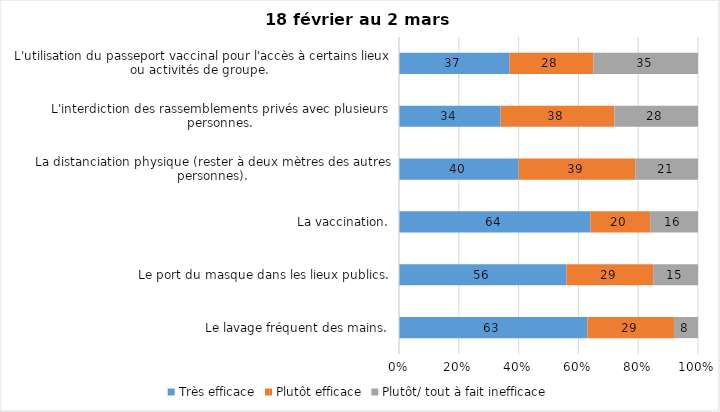
| Category | Très efficace | Plutôt efficace | Plutôt/ tout à fait inefficace |
|---|---|---|---|
| Le lavage fréquent des mains. | 63 | 29 | 8 |
| Le port du masque dans les lieux publics. | 56 | 29 | 15 |
| La vaccination. | 64 | 20 | 16 |
| La distanciation physique (rester à deux mètres des autres personnes). | 40 | 39 | 21 |
| L'interdiction des rassemblements privés avec plusieurs personnes. | 34 | 38 | 28 |
| L'utilisation du passeport vaccinal pour l'accès à certains lieux ou activités de groupe.  | 37 | 28 | 35 |